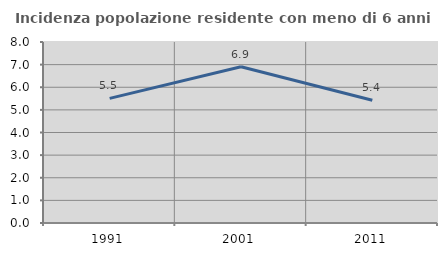
| Category | Incidenza popolazione residente con meno di 6 anni |
|---|---|
| 1991.0 | 5.508 |
| 2001.0 | 6.907 |
| 2011.0 | 5.428 |